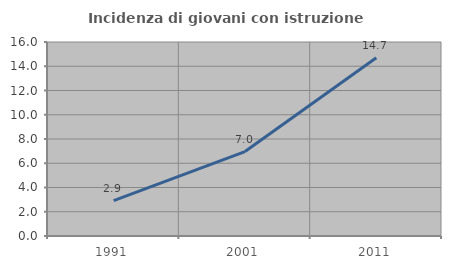
| Category | Incidenza di giovani con istruzione universitaria |
|---|---|
| 1991.0 | 2.914 |
| 2001.0 | 6.965 |
| 2011.0 | 14.7 |